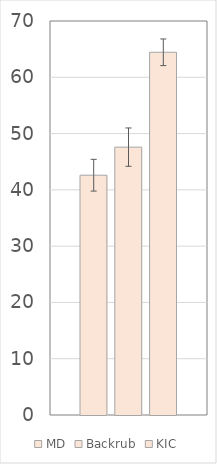
| Category | MD | Backrub | KIC |
|---|---|---|---|
| 0 | 42.603 | 47.592 | 64.444 |